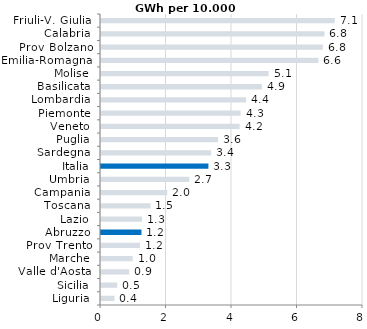
| Category | Series 0 |
|---|---|
| Liguria | 0.411 |
| Sicilia | 0.492 |
| Valle d'Aosta | 0.864 |
| Marche | 0.967 |
| Prov Trento | 1.19 |
| Abruzzo | 1.236 |
| Lazio | 1.255 |
| Toscana | 1.511 |
| Campania | 2.023 |
| Umbria | 2.696 |
| Italia | 3.28 |
| Sardegna | 3.362 |
| Puglia | 3.575 |
| Veneto | 4.234 |
| Piemonte | 4.263 |
| Lombardia | 4.432 |
| Basilicata | 4.911 |
| Molise | 5.118 |
| Emilia-Romagna | 6.641 |
| Prov Bolzano | 6.774 |
| Calabria | 6.823 |
| Friuli-V. Giulia | 7.136 |